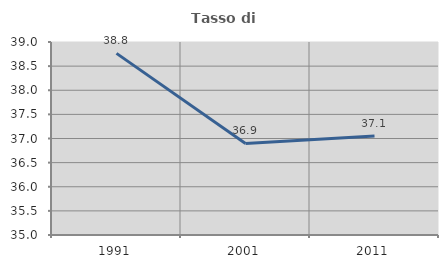
| Category | Tasso di occupazione   |
|---|---|
| 1991.0 | 38.764 |
| 2001.0 | 36.897 |
| 2011.0 | 37.05 |